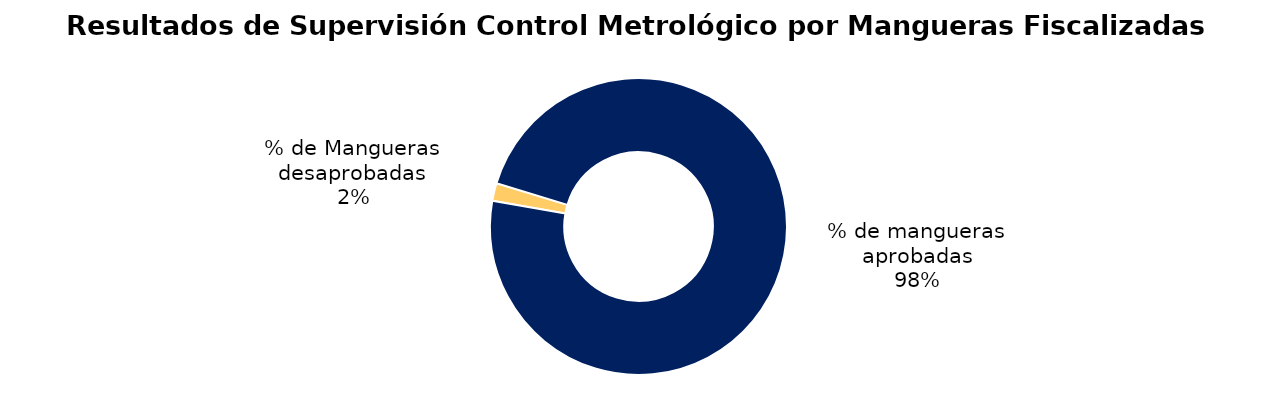
| Category | Series 0 |
|---|---|
| % de Mangueras desaprobadas | 45 |
| % de mangueras aprobadas | 2285 |